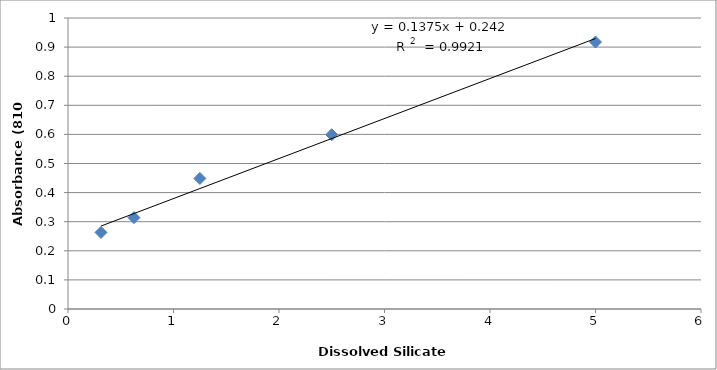
| Category | Series 0 |
|---|---|
| 0.3125 | 0.263 |
| 0.625 | 0.314 |
| 1.25 | 0.449 |
| 2.5 | 0.599 |
| 5.0 | 0.918 |